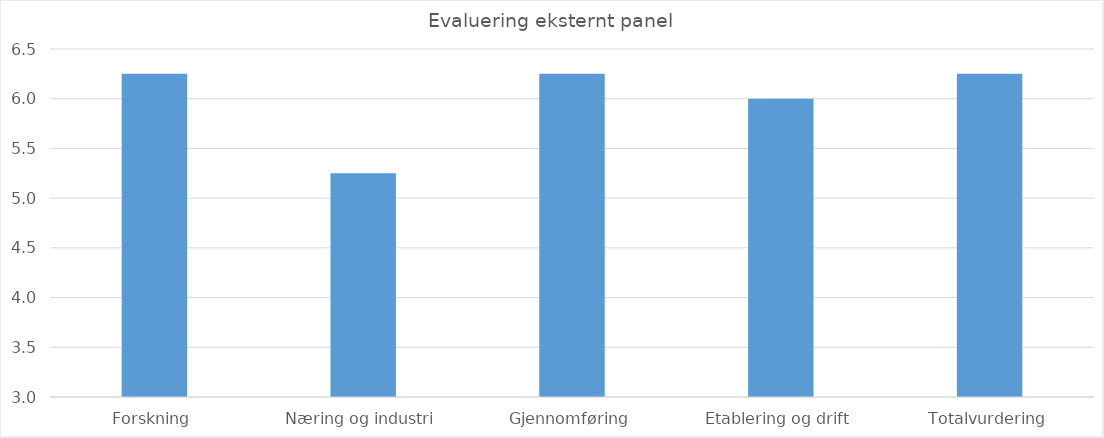
| Category | Series 0 |
|---|---|
| Forskning | 6.25 |
| Næring og industri | 5.25 |
| Gjennomføring | 6.25 |
| Etablering og drift | 6 |
| Totalvurdering | 6.25 |